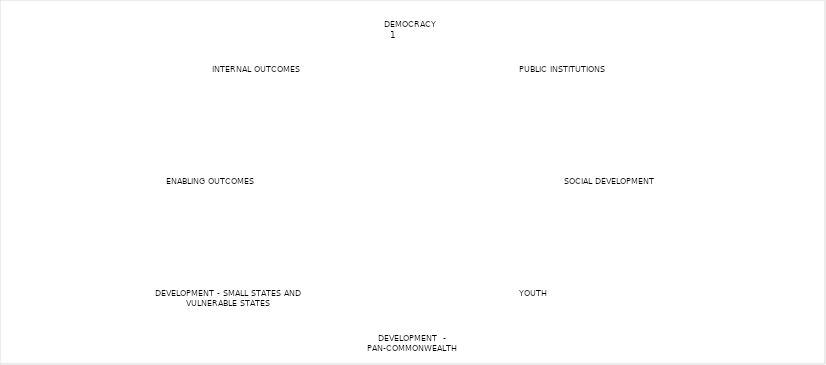
| Category | Series 0 |
|---|---|
| DEMOCRACY | 0 |
| PUBLIC INSTITUTIONS | 0 |
| SOCIAL DEVELOPMENT | 0 |
| YOUTH | 0 |
| DEVELOPMENT  - PAN-COMMONWEALTH | 0 |
| DEVELOPMENT - SMALL STATES AND VULNERABLE STATES | 0 |
| ENABLING OUTCOMES | 0 |
| INTERNAL OUTCOMES | 0 |